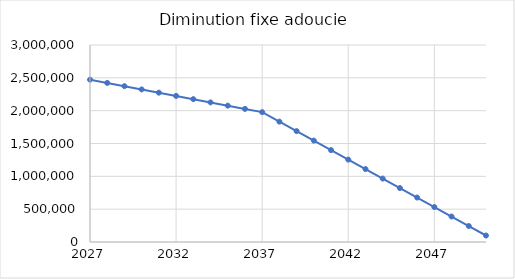
| Category | Diminution fixe adoucie |
|---|---|
| 2027.0 | 2471976 |
| 2028.0 | 2422536.48 |
| 2029.0 | 2373096.96 |
| 2030.0 | 2323657.44 |
| 2031.0 | 2274217.92 |
| 2032.0 | 2224778.4 |
| 2033.0 | 2175338.88 |
| 2034.0 | 2125899.36 |
| 2035.0 | 2076459.84 |
| 2036.0 | 2027020.32 |
| 2037.0 | 1977580.8 |
| 2038.0 | 1833059.2 |
| 2039.0 | 1688537.6 |
| 2040.0 | 1544016 |
| 2041.0 | 1399494.4 |
| 2042.0 | 1254972.8 |
| 2043.0 | 1110451.2 |
| 2044.0 | 965929.6 |
| 2045.0 | 821408 |
| 2046.0 | 676886.4 |
| 2047.0 | 532364.8 |
| 2048.0 | 387843.2 |
| 2049.0 | 243321.6 |
| 2050.0 | 98800 |